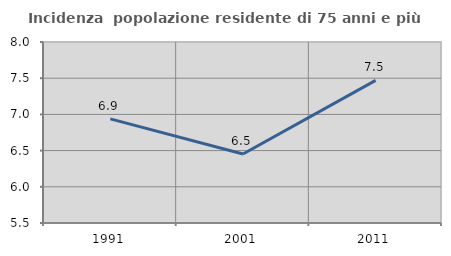
| Category | Incidenza  popolazione residente di 75 anni e più |
|---|---|
| 1991.0 | 6.938 |
| 2001.0 | 6.453 |
| 2011.0 | 7.471 |